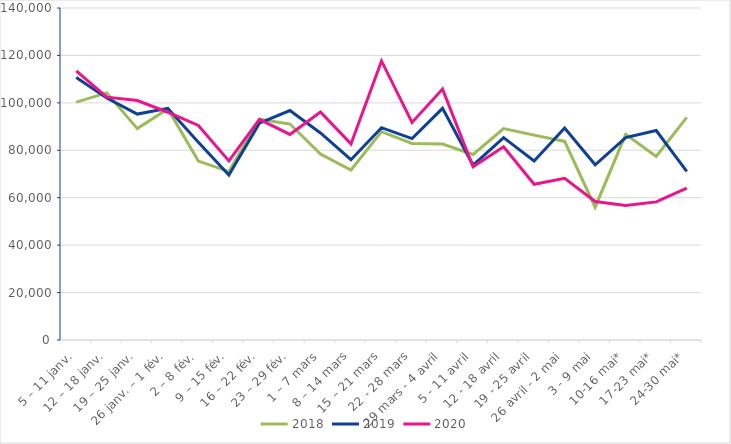
| Category | 2018 | 2019 | 2020 |
|---|---|---|---|
| 5 – 11 janv. | 100330 | 110701 | 113506 |
| 12 – 18 janv. | 104190 | 102045 | 102407 |
| 19 – 25 janv. | 89142 | 95260 | 100966 |
| 26 janv. – 1 fév. | 97441 | 97699 | 96042 |
| 2 – 8 fév. | 75434 | 83347 | 90495 |
| 9 – 15 fév. | 71031 | 69559 | 75523 |
| 16 – 22 fév. | 93102 | 91428 | 93003 |
| 23 – 29 fév. | 91065 | 96774 | 86699 |
| 1 – 7 mars | 78415 | 87314 | 96119 |
| 8 – 14 mars | 71697 | 76021 | 82690 |
| 15 – 21 mars | 87845 | 89536 | 117673 |
| 22 - 28 mars | 82895 | 84912 | 91763.636 |
| 29 mars - 4 avril | 82654 | 97699 | 105802 |
| 5 - 11 avril | 78244 | 73699 | 73060.606 |
| 12 - 18 avril | 89129 | 85348 | 81477 |
| 19 - 25 avril | 86398 | 75509 | 65653 |
| 26 avril - 2 mai | 83743 | 89413 | 68188 |
| 3 - 9 mai | 56008 | 73891 | 58423 |
| 10-16 mai* | 86722 | 85364 | 56762 |
| 17-23 mai* | 77423 | 88345 | 58234 |
| 24-30 mai* | 93888 | 71115 | 64082 |